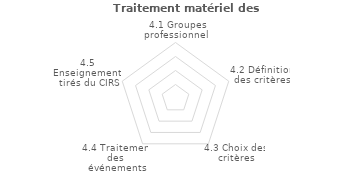
| Category | Series 2 |
|---|---|
| 4.1 Groupes professionnels | 0 |
| 4.2 Définition des critères | 0 |
| 4.3 Choix des critères | 0 |
| 4.4 Traitement des événements graves | 0 |
| 4.5 Enseignements tirés du CIRS | 0 |